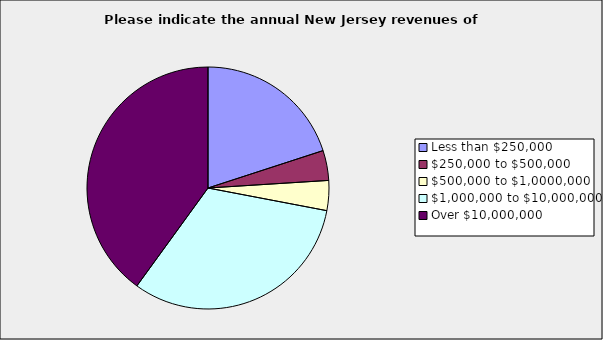
| Category | Series 0 |
|---|---|
| Less than $250,000 | 0.2 |
| $250,000 to $500,000 | 0.04 |
| $500,000 to $1,0000,000 | 0.04 |
| $1,000,000 to $10,000,000 | 0.32 |
| Over $10,000,000 | 0.4 |